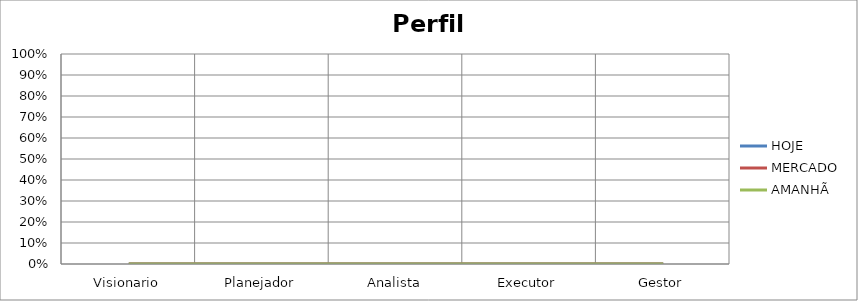
| Category | HOJE | MERCADO | AMANHÃ |
|---|---|---|---|
| Visionario | 0 | 0 | 0 |
| Planejador | 0 | 0 | 0 |
| Analista | 0 | 0 | 0 |
| Executor | 0 | 0 | 0 |
| Gestor | 0 | 0 | 0 |